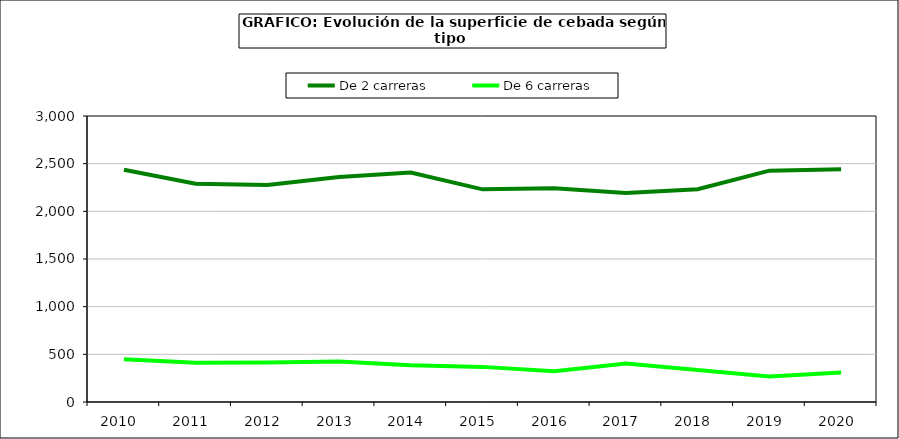
| Category | De 2 carreras | De 6 carreras |
|---|---|---|
| 2010  | 2436.435 | 449.177 |
| 2011  | 2289.976 | 410.703 |
| 2012  | 2276.855 | 414.231 |
| 2013  | 2360.129 | 424.153 |
| 2014  | 2407.693 | 384.533 |
| 2015  | 2230.462 | 368.434 |
| 2016  | 2241.385 | 321.81 |
| 2017  | 2192.938 | 404.589 |
| 2018  | 2232.782 | 336.68 |
| 2019  | 2426.41 | 267.098 |
| 2020  | 2440.617 | 308.422 |